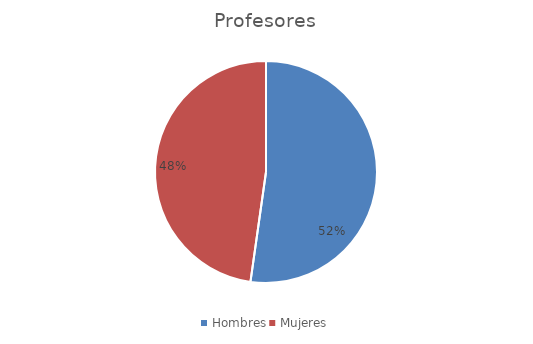
| Category | Profesores |
|---|---|
| Hombres | 35 |
| Mujeres | 32 |